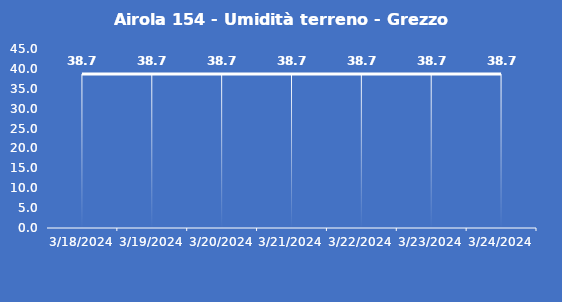
| Category | Airola 154 - Umidità terreno - Grezzo (%VWC) |
|---|---|
| 3/18/24 | 38.7 |
| 3/19/24 | 38.7 |
| 3/20/24 | 38.7 |
| 3/21/24 | 38.7 |
| 3/22/24 | 38.7 |
| 3/23/24 | 38.7 |
| 3/24/24 | 38.7 |